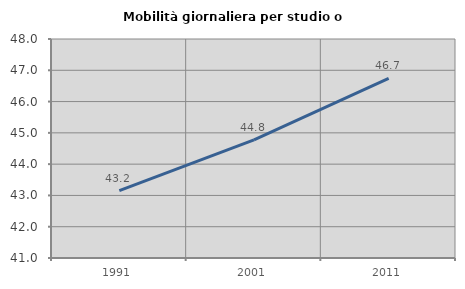
| Category | Mobilità giornaliera per studio o lavoro |
|---|---|
| 1991.0 | 43.153 |
| 2001.0 | 44.776 |
| 2011.0 | 46.744 |